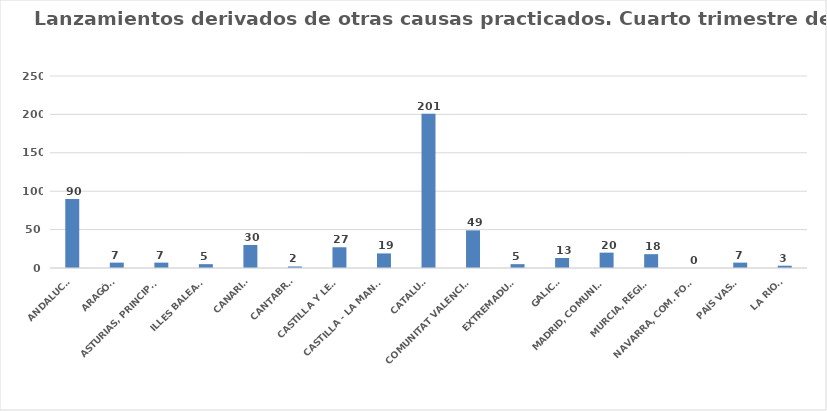
| Category | Series 0 |
|---|---|
| ANDALUCÍA | 90 |
| ARAGÓN | 7 |
| ASTURIAS, PRINCIPADO | 7 |
| ILLES BALEARS | 5 |
| CANARIAS | 30 |
| CANTABRIA | 2 |
| CASTILLA Y LEÓN | 27 |
| CASTILLA - LA MANCHA | 19 |
| CATALUÑA | 201 |
| COMUNITAT VALENCIANA | 49 |
| EXTREMADURA | 5 |
| GALICIA | 13 |
| MADRID, COMUNIDAD | 20 |
| MURCIA, REGIÓN | 18 |
| NAVARRA, COM. FORAL | 0 |
| PAÍS VASCO | 7 |
| LA RIOJA | 3 |